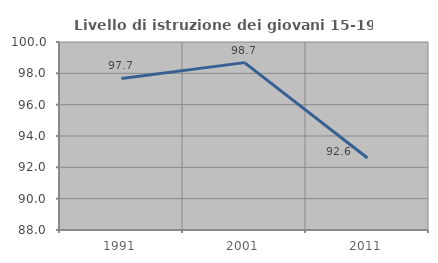
| Category | Livello di istruzione dei giovani 15-19 anni |
|---|---|
| 1991.0 | 97.674 |
| 2001.0 | 98.684 |
| 2011.0 | 92.593 |